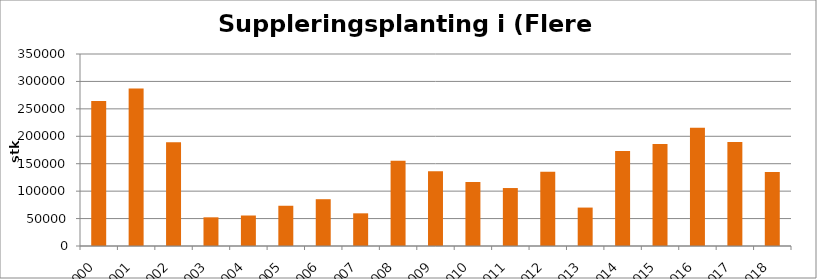
| Category | Totalt |
|---|---|
| 2000 | 264105 |
| 2001 | 286981 |
| 2002 | 189070 |
| 2003 | 52281 |
| 2004 | 55585 |
| 2005 | 73356 |
| 2006 | 85305 |
| 2007 | 59560 |
| 2008 | 155615 |
| 2009 | 136430 |
| 2010 | 116894 |
| 2011 | 105665 |
| 2012 | 135145 |
| 2013 | 70050 |
| 2014 | 173000 |
| 2015 | 185940 |
| 2016 | 215500 |
| 2017 | 189520 |
| 2018 | 135090 |